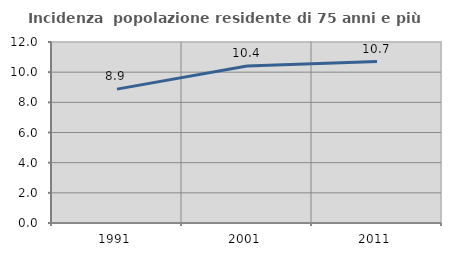
| Category | Incidenza  popolazione residente di 75 anni e più |
|---|---|
| 1991.0 | 8.876 |
| 2001.0 | 10.412 |
| 2011.0 | 10.707 |